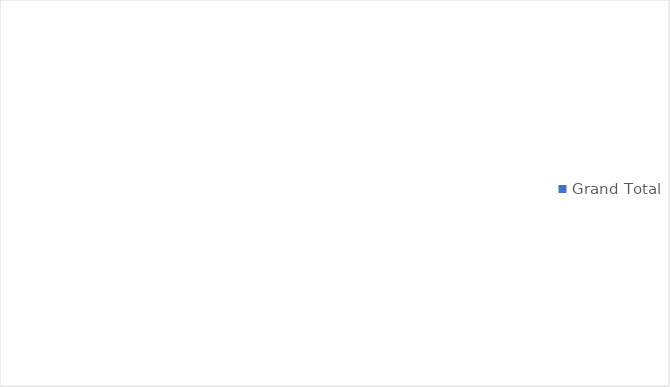
| Category | Grand Total |
|---|---|
| Grand Total | 0 |